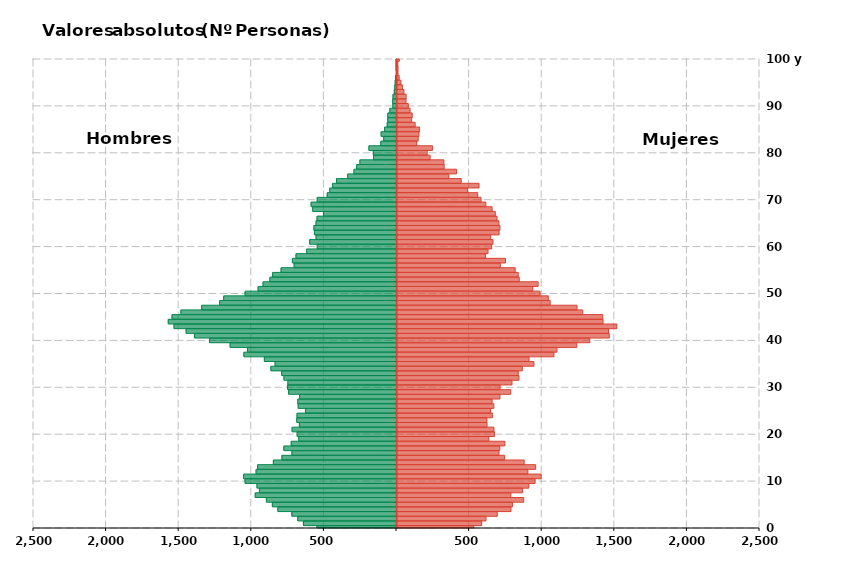
| Category | Hombres | Mujeres |
|---|---|---|
| 0 | -548 | 529 |
| 1 | -641 | 583 |
| 2 | -680 | 613 |
| 3 | -721 | 691 |
| 4 | -817 | 785 |
| 5 | -855 | 795 |
| 6 | -896 | 873 |
| 7 | -973 | 784 |
| 8 | -944 | 865 |
| 9 | -961 | 908 |
| 10 | -1043 | 951 |
| 11 | -1053 | 993 |
| 12 | -967 | 901 |
| 13 | -957 | 955 |
| 14 | -848 | 876 |
| 15 | -789 | 741 |
| 16 | -720 | 702 |
| 17 | -776 | 708 |
| 18 | -725 | 743 |
| 19 | -673 | 632 |
| 20 | -684 | 671 |
| 21 | -719 | 668 |
| 22 | -669 | 620 |
| 23 | -687 | 619 |
| 24 | -685 | 657 |
| 25 | -627 | 644 |
| 26 | -677 | 667 |
| 27 | -680 | 655 |
| 28 | -668 | 709 |
| 29 | -743 | 783 |
| 30 | -750 | 710 |
| 31 | -748 | 792 |
| 32 | -775 | 840 |
| 33 | -791 | 835 |
| 34 | -865 | 863 |
| 35 | -836 | 943 |
| 36 | -910 | 909 |
| 37 | -1051 | 1081 |
| 38 | -1026 | 1102 |
| 39 | -1146 | 1238 |
| 40 | -1288 | 1328 |
| 41 | -1391 | 1462 |
| 42 | -1449 | 1457 |
| 43 | -1532 | 1514 |
| 44 | -1572 | 1419 |
| 45 | -1546 | 1417 |
| 46 | -1485 | 1279 |
| 47 | -1342 | 1240 |
| 48 | -1218 | 1055 |
| 49 | -1190 | 1042 |
| 50 | -1043 | 985 |
| 51 | -953 | 935 |
| 52 | -919 | 972 |
| 53 | -872 | 842 |
| 54 | -853 | 835 |
| 55 | -795 | 814 |
| 56 | -705 | 712 |
| 57 | -717 | 747 |
| 58 | -692 | 610 |
| 59 | -619 | 627 |
| 60 | -546 | 652 |
| 61 | -598 | 661 |
| 62 | -554 | 645 |
| 63 | -565 | 703 |
| 64 | -569 | 709 |
| 65 | -554 | 702 |
| 66 | -547 | 689 |
| 67 | -503 | 677 |
| 68 | -577 | 655 |
| 69 | -588 | 612 |
| 70 | -546 | 579 |
| 71 | -477 | 556 |
| 72 | -460 | 486 |
| 73 | -440 | 565 |
| 74 | -413 | 442 |
| 75 | -336 | 357 |
| 76 | -293 | 410 |
| 77 | -274 | 325 |
| 78 | -252 | 323 |
| 79 | -158 | 228 |
| 80 | -160 | 208 |
| 81 | -190 | 244 |
| 82 | -108 | 136 |
| 83 | -88 | 146 |
| 84 | -106 | 151 |
| 85 | -82 | 156 |
| 86 | -64 | 125 |
| 87 | -60 | 101 |
| 88 | -60 | 105 |
| 89 | -46 | 90 |
| 90 | -25 | 78 |
| 91 | -26 | 62 |
| 92 | -24 | 63 |
| 93 | -15 | 48 |
| 94 | -12 | 37 |
| 95 | -9 | 27 |
| 96 | -7 | 15 |
| 97 | -1 | 7 |
| 98 | -3 | 7 |
| 99 | -3 | 6 |
| 100 | -3 | 16 |